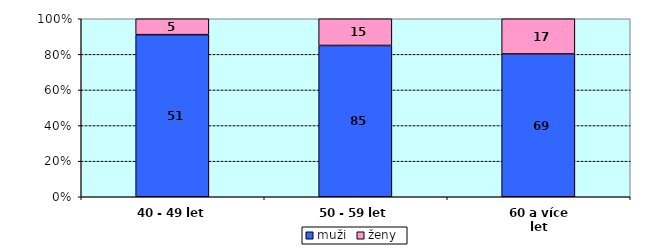
| Category | muži | ženy |
|---|---|---|
| 40 - 49 let | 51 | 5 |
| 50 - 59 let | 85 | 15 |
| 60 a více let | 69 | 17 |